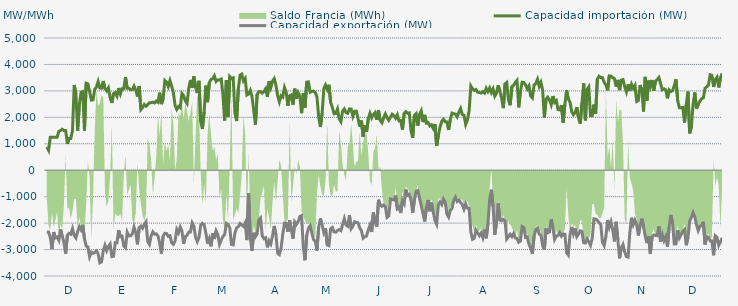
| Category | Capacidad importación (MW) | Capacidad exportación (MW) |
|---|---|---|
| 0 | 879.167 | -2332.417 |
| 1900-01-01 | 750 | -2334.958 |
| 1900-01-02 | 1250 | -2536 |
| 1900-01-03 | 1250 | -2982 |
| 1900-01-04 | 1250 | -2338.583 |
| 1900-01-05 | 1250 | -2558.333 |
| 1900-01-06 | 1250 | -2526.375 |
| 1900-01-07 | 1470.833 | -2652.25 |
| 1900-01-08 | 1500 | -2239.292 |
| 1900-01-09 | 1550 | -2486.75 |
| 1900-01-10 | 1500 | -2733.5 |
| 1900-01-11 | 1500 | -3155.125 |
| 1900-01-12 | 1000 | -2458.542 |
| 1900-01-13 | 1200 | -2385.25 |
| 1900-01-14 | 1200 | -2419 |
| 1900-01-15 | 1500 | -2208.75 |
| 1900-01-16 | 3221.708 | -2468.625 |
| 1900-01-17 | 2881.375 | -2561.25 |
| 1900-01-18 | 1500 | -2320.833 |
| 1900-01-19 | 2479.75 | -2136.875 |
| 1900-01-20 | 2947.875 | -2253.917 |
| 1900-01-21 | 2974.833 | -2068.75 |
| 1900-01-22 | 1500 | -2595.083 |
| 1900-01-23 | 3289.208 | -2867.583 |
| 1900-01-24 | 3267.875 | -2898.625 |
| 1900-01-25 | 2979.083 | -3270.083 |
| 1900-01-26 | 2652.375 | -3097.333 |
| 1900-01-27 | 2663.208 | -3144.542 |
| 1900-01-28 | 3058.292 | -3107.917 |
| 1900-01-29 | 3141.958 | -3054.292 |
| 1900-01-30 | 3354.667 | -3163.833 |
| 1900-01-31 | 3106.083 | -3500.875 |
| 1900-02-01 | 3099.042 | -3464.417 |
| 1900-02-02 | 3374.208 | -3046.25 |
| 1900-02-03 | 3081.083 | -2836.417 |
| 1900-02-04 | 3002 | -3040.417 |
| 1900-02-05 | 3113.875 | -2884.417 |
| 1900-02-06 | 2746.792 | -2789.333 |
| 1900-02-07 | 2544 | -3266.167 |
| 1900-02-08 | 2896.458 | -3250.667 |
| 1900-02-09 | 2937 | -2740.375 |
| 1900-02-10 | 2803.458 | -2745 |
| 1900-02-11 | 3104.125 | -2267.833 |
| 1900-02-12 | 2884.333 | -2514.583 |
| 1900-02-13 | 3081.042 | -2493.458 |
| 1900-02-14 | 3079.083 | -2866 |
| 1900-02-15 | 3524.292 | -2932.083 |
| 1900-02-16 | 3096.5 | -2347.083 |
| 1900-02-17 | 3096.5 | -2484.875 |
| 1900-02-18 | 3044.417 | -2478.583 |
| 1900-02-19 | 3048.167 | -2403.5 |
| 1900-02-20 | 3181.083 | -2147.542 |
| 1900-02-21 | 3030.708 | -2365.833 |
| 1900-02-22 | 2784.5 | -2801.333 |
| 1900-02-23 | 3182.417 | -2165.083 |
| 1900-02-24 | 2292.583 | -2110.5 |
| 1900-02-25 | 2370.25 | -2192.75 |
| 1900-02-26 | 2487.208 | -2051.417 |
| 1900-02-27 | 2421.292 | -1952.083 |
| 1900-02-28 | 2482.917 | -2699.375 |
| 1900-02-28 | 2548.458 | -2805.375 |
| 1900-03-01 | 2554.458 | -2484.042 |
| 1900-03-02 | 2574.083 | -2331.417 |
| 1900-03-03 | 2544.458 | -2417.833 |
| 1900-03-04 | 2615.833 | -2403.25 |
| 1900-03-05 | 2568.917 | -2488.625 |
| 1900-03-06 | 2932.208 | -2748.875 |
| 1900-03-07 | 2500.875 | -3160.125 |
| 1900-03-08 | 2689.458 | -2491.667 |
| 1900-03-09 | 3392.292 | -2386.5 |
| 1900-03-10 | 3335.083 | -2392.75 |
| 1900-03-11 | 3167.5 | -2500.5 |
| 1900-03-12 | 3390.625 | -2475.917 |
| 1900-03-13 | 3180.958 | -2741.75 |
| 1900-03-14 | 2936.5 | -2801.625 |
| 1900-03-15 | 2452.792 | -2674.667 |
| 1900-03-16 | 2300.208 | -2235.25 |
| 1900-03-17 | 2411.792 | -2365.167 |
| 1900-03-18 | 2366.75 | -2147.917 |
| 1900-03-19 | 2902.042 | -2292.875 |
| 1900-03-20 | 2822.25 | -2784.375 |
| 1900-03-21 | 2619.333 | -2505.792 |
| 1900-03-22 | 2523.292 | -2462.542 |
| 1900-03-23 | 3101.75 | -2337.5 |
| 1900-03-24 | 3414.042 | -2335.5 |
| 1900-03-25 | 3119.417 | -1987.458 |
| 1900-03-26 | 3547.333 | -2114.583 |
| 1900-03-27 | 3135.708 | -2530.042 |
| 1900-03-28 | 2921.125 | -2699.333 |
| 1900-03-29 | 3380.917 | -2535.75 |
| 1900-03-30 | 1842.042 | -2078.542 |
| 1900-03-31 | 1566.833 | -2010.417 |
| 1900-04-01 | 2214.542 | -2066.667 |
| 1900-04-02 | 3198.583 | -2370 |
| 1900-04-03 | 2574 | -2772.958 |
| 1900-04-04 | 3310.583 | -2592.083 |
| 1900-04-05 | 3430.75 | -2875.542 |
| 1900-04-06 | 3458.333 | -2387.75 |
| 1900-04-07 | 3568.125 | -2599.208 |
| 1900-04-08 | 3355.708 | -2294.333 |
| 1900-04-09 | 3414.333 | -2427 |
| 1900-04-10 | 3410.542 | -2802.125 |
| 1900-04-11 | 3447.375 | -2640.958 |
| 1900-04-12 | 2831.208 | -2506.667 |
| 1900-04-13 | 1881.583 | -2434.25 |
| 1900-04-14 | 3406.708 | -2011.583 |
| 1900-04-15 | 2022.5 | -2050 |
| 1900-04-16 | 3540.875 | -2176.417 |
| 1900-04-17 | 3466.542 | -2807.167 |
| 1900-04-18 | 3493.375 | -2823.167 |
| 1900-04-19 | 2166.833 | -2382.125 |
| 1900-04-20 | 1859.958 | -2177.167 |
| 1900-04-21 | 3077.875 | -2132.833 |
| 1900-04-22 | 3595.75 | -2015.417 |
| 1900-04-23 | 3634.375 | -2069.417 |
| 1900-04-24 | 3379.833 | -2125 |
| 1900-04-25 | 3470.304 | -1991.957 |
| 1900-04-26 | 2844 | -2641.708 |
| 1900-04-27 | 2880.625 | -862.5 |
| 1900-04-28 | 3017.208 | -2558.208 |
| 1900-04-29 | 2787.708 | -3047.042 |
| 1900-04-30 | 2256.625 | -2365.667 |
| 1900-05-01 | 1722.917 | -2515.917 |
| 1900-05-02 | 2869 | -2405.667 |
| 1900-05-03 | 2973.167 | -1879.167 |
| 1900-05-04 | 2971 | -1806.25 |
| 1900-05-05 | 2919.208 | -2484.833 |
| 1900-05-06 | 2973.125 | -2583.917 |
| 1900-05-07 | 3083.25 | -2551.375 |
| 1900-05-08 | 2777.875 | -2917.292 |
| 1900-05-09 | 3371.833 | -2672.292 |
| 1900-05-10 | 3131 | -2785.25 |
| 1900-05-11 | 3368.375 | -2480.958 |
| 1900-05-12 | 3462.292 | -2105.333 |
| 1900-05-13 | 3215.917 | -2442.958 |
| 1900-05-14 | 2817.875 | -3136.917 |
| 1900-05-15 | 2586 | -3188.792 |
| 1900-05-16 | 2815 | -2954.042 |
| 1900-05-17 | 2767 | -2418.75 |
| 1900-05-18 | 3129.208 | -2005 |
| 1900-05-19 | 2953.792 | -2013.417 |
| 1900-05-20 | 2437.083 | -2329.833 |
| 1900-05-21 | 2815.958 | -1889.333 |
| 1900-05-22 | 2849.708 | -2257.667 |
| 1900-05-23 | 2479.208 | -2586.833 |
| 1900-05-24 | 3084.333 | -1954.5 |
| 1900-05-25 | 2707.042 | -2046.583 |
| 1900-05-26 | 2933.542 | -1941.667 |
| 1900-05-27 | 2795.917 | -1750 |
| 1900-05-28 | 2158.042 | -1718.75 |
| 1900-05-29 | 2918.875 | -2898.083 |
| 1900-05-30 | 2368.375 | -3404.167 |
| 1900-05-31 | 3329.75 | -2465.083 |
| 1900-06-01 | 3339.208 | -2197.25 |
| 1900-06-02 | 2948.5 | -2100.583 |
| 1900-06-03 | 2980.792 | -2371.042 |
| 1900-06-04 | 2990.708 | -2620.708 |
| 1900-06-05 | 2938.333 | -2683 |
| 1900-06-06 | 2774.542 | -3036.75 |
| 1900-06-07 | 2014.917 | -2156.292 |
| 1900-06-08 | 1635.417 | -1825.292 |
| 1900-06-09 | 2140.25 | -2060.75 |
| 1900-06-10 | 3080.917 | -2353.125 |
| 1900-06-11 | 3223.333 | -2199.083 |
| 1900-06-12 | 3058.083 | -2827.667 |
| 1900-06-13 | 3231.167 | -2853.292 |
| 1900-06-14 | 2562 | -2213.625 |
| 1900-06-15 | 2375 | -2164.25 |
| 1900-06-16 | 2133.333 | -2329.5 |
| 1900-06-17 | 2150 | -2341.083 |
| 1900-06-18 | 2314.583 | -2282 |
| 1900-06-19 | 1943.75 | -2242.25 |
| 1900-06-20 | 1835.625 | -2285.208 |
| 1900-06-21 | 2235.417 | -2055.542 |
| 1900-06-22 | 2316.667 | -1831.25 |
| 1900-06-23 | 2178.125 | -2071.583 |
| 1900-06-24 | 2154.167 | -2116.125 |
| 1900-06-25 | 2321.417 | -1699.458 |
| 1900-06-26 | 2312 | -2210.167 |
| 1900-06-27 | 2040.917 | -2118.083 |
| 1900-06-28 | 2233.083 | -1949.458 |
| 1900-06-29 | 2234.854 | -1977.083 |
| 1900-06-30 | 1964.583 | -1985.792 |
| 1900-07-01 | 1650 | -2177.417 |
| 1900-07-02 | 1877.083 | -2287.667 |
| 1900-07-03 | 1264.583 | -2568.708 |
| 1900-07-04 | 1691.667 | -2512.667 |
| 1900-07-05 | 1456.25 | -2486.333 |
| 1900-07-06 | 1945.833 | -2259.083 |
| 1900-07-07 | 2154.167 | -2079.5 |
| 1900-07-08 | 1979.167 | -2336.083 |
| 1900-07-09 | 2104.167 | -1597.917 |
| 1900-07-10 | 2179.167 | -1954.167 |
| 1900-07-11 | 1908.333 | -2131.25 |
| 1900-07-12 | 2262.5 | -1118.75 |
| 1900-07-13 | 1879.167 | -1314.583 |
| 1900-07-14 | 1791.667 | -1368 |
| 1900-07-15 | 1977.083 | -1316.667 |
| 1900-07-16 | 2127.083 | -1377.083 |
| 1900-07-17 | 1987.5 | -1785.417 |
| 1900-07-18 | 1887.5 | -1733.333 |
| 1900-07-19 | 2002.083 | -1085.417 |
| 1900-07-20 | 2118.75 | -1110.417 |
| 1900-07-21 | 2066.667 | -1125 |
| 1900-07-22 | 1966.667 | -958.333 |
| 1900-07-23 | 2097.917 | -1454.167 |
| 1900-07-24 | 1864.583 | -1397.917 |
| 1900-07-25 | 1877.083 | -1618.75 |
| 1900-07-26 | 1537.5 | -1143.75 |
| 1900-07-27 | 2145.833 | -1264 |
| 1900-07-28 | 2216.667 | -731.25 |
| 1900-07-29 | 2150 | -950 |
| 1900-07-30 | 2167.583 | -916.667 |
| 1900-07-31 | 1493.75 | -1122.25 |
| 1900-08-01 | 1220.833 | -1604.167 |
| 1900-08-02 | 2072.917 | -1125 |
| 1900-08-03 | 2139.583 | -791.667 |
| 1900-08-04 | 1687.5 | -764.583 |
| 1900-08-05 | 2116.667 | -1058.333 |
| 1900-08-06 | 2247.917 | -1337.5 |
| 1900-08-07 | 1818.75 | -1627.083 |
| 1900-08-08 | 2093.75 | -1937.5 |
| 1900-08-09 | 1781.25 | -1422.917 |
| 1900-08-10 | 1804.167 | -1127.083 |
| 1900-08-11 | 1675 | -1552.083 |
| 1900-08-12 | 1716.667 | -1225 |
| 1900-08-13 | 1583.333 | -1570.833 |
| 1900-08-14 | 1747.917 | -1904.167 |
| 1900-08-15 | 918.75 | -2042.875 |
| 1900-08-16 | 1314.583 | -1310.417 |
| 1900-08-17 | 1629.167 | -1200 |
| 1900-08-18 | 1852.083 | -1300.583 |
| 1900-08-19 | 1925 | -1095.833 |
| 1900-08-20 | 1835.417 | -1208.333 |
| 1900-08-21 | 1827.083 | -1656.25 |
| 1900-08-22 | 1522.917 | -1770.917 |
| 1900-08-23 | 1916.667 | -1518.75 |
| 1900-08-24 | 2160.417 | -1441.667 |
| 1900-08-25 | 2139.583 | -1137.5 |
| 1900-08-26 | 2120.833 | -1018.75 |
| 1900-08-27 | 2018.75 | -1183.333 |
| 1900-08-28 | 2193.75 | -1127.083 |
| 1900-08-29 | 2333.333 | -1220.833 |
| 1900-08-30 | 2108.333 | -1295.833 |
| 1900-08-31 | 2079.833 | -1472.917 |
| 1900-09-01 | 1729.167 | -1281.25 |
| 1900-09-02 | 1897.917 | -1434.542 |
| 1900-09-03 | 2247 | -1443.75 |
| 1900-09-04 | 3185.083 | -2337 |
| 1900-09-05 | 3075.167 | -2613.625 |
| 1900-09-06 | 3013.625 | -2576.5 |
| 1900-09-07 | 3052.042 | -2269.25 |
| 1900-09-08 | 2946.333 | -2370.833 |
| 1900-09-09 | 2940.542 | -2478.958 |
| 1900-09-10 | 2917.208 | -2375.625 |
| 1900-09-11 | 2971.167 | -2551.875 |
| 1900-09-12 | 2917.292 | -2238 |
| 1900-09-13 | 3101.958 | -2573.167 |
| 1900-09-14 | 2973.375 | -2041.667 |
| 1900-09-15 | 3109.875 | -1120.167 |
| 1900-09-16 | 2936.333 | -737.5 |
| 1900-09-17 | 3074.833 | -1371.667 |
| 1900-09-18 | 2802.417 | -2434.917 |
| 1900-09-19 | 2913.625 | -1996.875 |
| 1900-09-20 | 3212.125 | -1254.167 |
| 1900-09-21 | 2973 | -1887.5 |
| 1900-09-22 | 2732 | -1910.417 |
| 1900-09-23 | 2348.333 | -1858 |
| 1900-09-24 | 3266 | -1911.25 |
| 1900-09-25 | 3318.417 | -2603.917 |
| 1900-09-26 | 2666.292 | -2519.292 |
| 1900-09-27 | 2457.667 | -2420.375 |
| 1900-09-28 | 3159.917 | -2510.583 |
| 1900-09-29 | 3208.208 | -2395.833 |
| 1900-09-30 | 3322.042 | -2559.25 |
| 1900-10-01 | 3397.292 | -2579.208 |
| 1900-10-02 | 2377.292 | -2722 |
| 1900-10-03 | 2966.875 | -2678.583 |
| 1900-10-04 | 3327.583 | -2120.833 |
| 1900-10-05 | 3314.125 | -2154.167 |
| 1900-10-06 | 3229.625 | -2542.417 |
| 1900-10-07 | 3075.125 | -2524.125 |
| 1900-10-08 | 3186.833 | -2800.875 |
| 1900-10-09 | 2804.417 | -2944.208 |
| 1900-10-10 | 2733.75 | -3162.5 |
| 1900-10-11 | 3225.458 | -2491.042 |
| 1900-10-12 | 3275.667 | -2238.417 |
| 1900-10-13 | 3439.5 | -2190.417 |
| 1900-10-14 | 3175.292 | -2417.375 |
| 1900-10-15 | 3321.875 | -2458.417 |
| 1900-10-16 | 3034.917 | -2846.167 |
| 1900-10-17 | 1991.917 | -3010.667 |
| 1900-10-18 | 2685.833 | -2200.25 |
| 1900-10-19 | 2763.167 | -2365.208 |
| 1900-10-20 | 2664.875 | -2334.375 |
| 1900-10-21 | 2477.792 | -1849.417 |
| 1900-10-22 | 2804.25 | -2175.083 |
| 1900-10-23 | 2563.458 | -2614.833 |
| 1900-10-24 | 2629.917 | -2484.333 |
| 1900-10-25 | 2292 | -2469.792 |
| 1900-10-26 | 2284.542 | -2356.917 |
| 1900-10-27 | 2456.5 | -2494.792 |
| 1900-10-28 | 1801.792 | -2413.833 |
| 1900-10-29 | 2484.917 | -2419 |
| 1900-10-30 | 3029.417 | -3108.292 |
| 1900-10-31 | 2693.417 | -3201.125 |
| 1900-11-01 | 2579.5 | -2439 |
| 1900-11-02 | 2220.833 | -2146.167 |
| 1900-11-03 | 2100 | -2410.292 |
| 1900-11-04 | 2179.167 | -2202.083 |
| 1900-11-05 | 2381.25 | -2508.5 |
| 1900-11-06 | 1970.833 | -2414.375 |
| 1900-11-07 | 1758.333 | -2292.792 |
| 1900-11-08 | 2544 | -2324.083 |
| 1900-11-09 | 3285.125 | -2739.75 |
| 1900-11-10 | 1885.375 | -2754.917 |
| 1900-11-11 | 3057.958 | -2601 |
| 1900-11-12 | 3152.583 | -2708.375 |
| 1900-11-13 | 2068.833 | -2840.833 |
| 1900-11-14 | 2060.917 | -2586.417 |
| 1900-11-15 | 2484.25 | -1839.417 |
| 1900-11-16 | 2141.208 | -1845.833 |
| 1900-11-17 | 3445.375 | -1893.75 |
| 1900-11-18 | 3555.25 | -1979.583 |
| 1900-11-19 | 3506.875 | -2054.167 |
| 1900-11-20 | 3499.292 | -2730 |
| 1900-11-21 | 3321.917 | -2848.375 |
| 1900-11-22 | 3225.583 | -2505.583 |
| 1900-11-23 | 3019.583 | -1882.958 |
| 1900-11-24 | 3568.667 | -2157.833 |
| 1900-11-25 | 3559.375 | -1957.75 |
| 1900-11-26 | 3503.125 | -2252.375 |
| 1900-11-27 | 3464.458 | -2689.458 |
| 1900-11-28 | 3159.52 | -1949.52 |
| 1900-11-29 | 3414.875 | -2624.75 |
| 1900-11-30 | 3028.417 | -3331.875 |
| 1900-12-01 | 3406.833 | -2936.5 |
| 1900-12-02 | 3428.875 | -2811.25 |
| 1900-12-03 | 3154.208 | -3088.625 |
| 1900-12-04 | 2961.542 | -3268.083 |
| 1900-12-05 | 3246.75 | -3285.125 |
| 1900-12-06 | 2998.792 | -2359.333 |
| 1900-12-07 | 3250.625 | -1795.833 |
| 1900-12-08 | 3098.083 | -2058.458 |
| 1900-12-09 | 3208.458 | -1889.583 |
| 1900-12-10 | 2600.833 | -2050 |
| 1900-12-11 | 2636.458 | -2468.208 |
| 1900-12-12 | 3221.75 | -2100 |
| 1900-12-13 | 3030.917 | -1831.25 |
| 1900-12-14 | 2221.417 | -2127.083 |
| 1900-12-15 | 3529.833 | -2490.5 |
| 1900-12-16 | 2631.583 | -2756.25 |
| 1900-12-17 | 3389.417 | -2493.667 |
| 1900-12-18 | 3161.917 | -3158.375 |
| 1900-12-19 | 3412.417 | -2518.792 |
| 1900-12-20 | 3004.917 | -2450.333 |
| 1900-12-21 | 3360.75 | -2463.25 |
| 1900-12-22 | 3427.958 | -2474.292 |
| 1900-12-23 | 3506.917 | -2123.5 |
| 1900-12-24 | 3269.708 | -2701.708 |
| 1900-12-25 | 3043.333 | -2440.417 |
| 1900-12-26 | 3078.833 | -2660.667 |
| 1900-12-27 | 3042.542 | -2510.25 |
| 1900-12-28 | 2720.083 | -2892.208 |
| 1900-12-29 | 3035.792 | -2156.833 |
| 1900-12-30 | 2973.125 | -1691.667 |
| 1900-12-31 | 3008.708 | -2006.25 |
| 1901-01-01 | 3198.417 | -2788.271 |
| 1901-01-02 | 3439.5 | -2780.875 |
| 1901-01-03 | 2626.625 | -2273 |
| 1901-01-04 | 2364.583 | -2564.167 |
| 1901-01-05 | 2360.417 | -2440.708 |
| 1901-01-06 | 2372.917 | -2302.125 |
| 1901-01-07 | 1804.167 | -2241.25 |
| 1901-01-08 | 2476.875 | -2836.292 |
| 1901-01-09 | 2972.208 | -2552.292 |
| 1901-01-10 | 1394.917 | -1922 |
| 1901-01-11 | 1635.417 | -1780.667 |
| 1901-01-12 | 2487.208 | -1602.083 |
| 1901-01-13 | 2938.333 | -1770.833 |
| 1901-01-14 | 2333.708 | -2058.75 |
| 1901-01-15 | 2480.333 | -2280.5 |
| 1901-01-16 | 2612.458 | -2120.333 |
| 1901-01-17 | 2705.792 | -2095.25 |
| 1901-01-18 | 2735.375 | -1951.833 |
| 1901-01-19 | 3100.375 | -2807.583 |
| 1901-01-20 | 3154.125 | -2514.417 |
| 1901-01-21 | 3216.042 | -2530.208 |
| 1901-01-22 | 3609.167 | -2672.875 |
| 1901-01-23 | 3585.958 | -2674.5 |
| 1901-01-24 | 3148.417 | -3214.25 |
| 1901-01-25 | 3433.542 | -2480.667 |
| 1901-01-26 | 3518.5 | -2539.5 |
| 1901-01-27 | 3130.292 | -2838.583 |
| 1901-01-28 | 3499.167 | -2718.417 |
| 1901-01-29 | 3663.042 | -2554.083 |